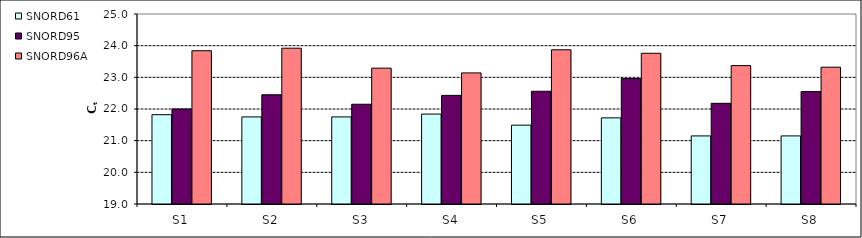
| Category | SNORD61 | SNORD95 | SNORD96A |
|---|---|---|---|
| S1 | 21.82 | 22 | 23.84 |
| S2 | 21.75 | 22.45 | 23.92 |
| S3 | 21.75 | 22.15 | 23.29 |
| S4 | 21.84 | 22.43 | 23.14 |
| S5 | 21.49 | 22.56 | 23.87 |
| S6 | 21.72 | 22.96 | 23.76 |
| S7 | 21.15 | 22.18 | 23.37 |
| S8 | 21.15 | 22.55 | 23.32 |